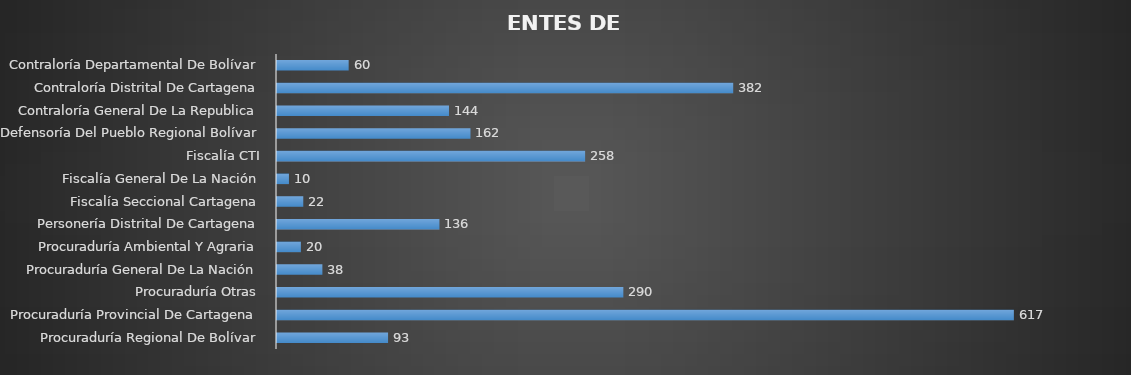
| Category | ENTES DE CONTROL |
|---|---|
| Contraloría Departamental De Bolívar | 60 |
| Contraloría Distrital De Cartagena | 382 |
| Contraloría General De La Republica | 144 |
| Defensoría Del Pueblo Regional Bolívar | 162 |
| Fiscalía CTI | 258 |
| Fiscalía General De La Nación | 10 |
| Fiscalía Seccional Cartagena | 22 |
| Personería Distrital De Cartagena | 136 |
| Procuraduría Ambiental Y Agraria | 20 |
| Procuraduría General De La Nación | 38 |
| Procuraduría Otras | 290 |
| Procuraduría Provincial De Cartagena | 617 |
| Procuraduría Regional De Bolívar | 93 |